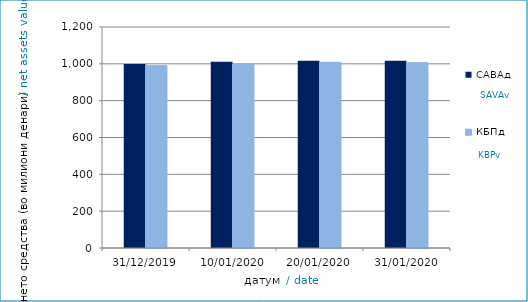
| Category | САВАд | КБПд |
|---|---|---|
| 31/12/2019 | 998.778 | 990.04 |
| 10/01/2020 | 1011.892 | 998.998 |
| 20/01/2020 | 1016.372 | 1008.034 |
| 31/01/2020 | 1016.394 | 1006.403 |